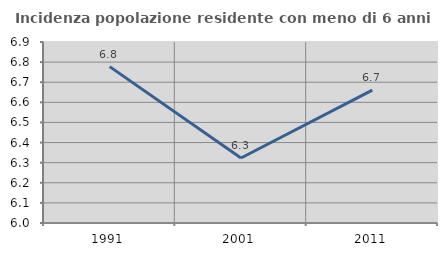
| Category | Incidenza popolazione residente con meno di 6 anni |
|---|---|
| 1991.0 | 6.778 |
| 2001.0 | 6.323 |
| 2011.0 | 6.66 |